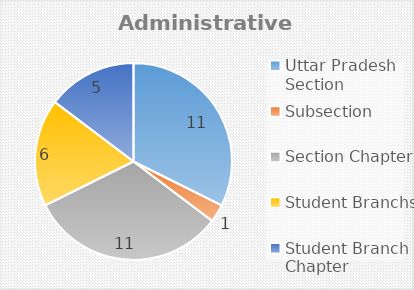
| Category | Series 0 |
|---|---|
| Uttar Pradesh Section | 11 |
| Subsection | 1 |
| Section Chapter | 11 |
| Student Branchs | 6 |
| Student Branch Chapter | 5 |